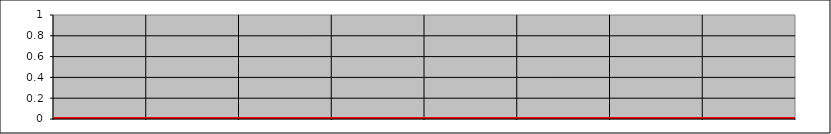
| Category | Series 1 | Series 2 | Series 4 | Series 0 |
|---|---|---|---|---|
| 0 | 0 | 0 | 0 |  |
| 1 | 0 | 0 | 0 |  |
| 2 | 0 | 0 | 0 |  |
| 3 | 0 | 0 | 0 |  |
| 4 | 0 | 0 | 0 |  |
| 5 | 0 | 0 | 0 |  |
| 6 | 0 | 0 | 0 |  |
| 7 | 0 | 0 | 0 |  |
| 8 | 0 | 0 | 0 |  |